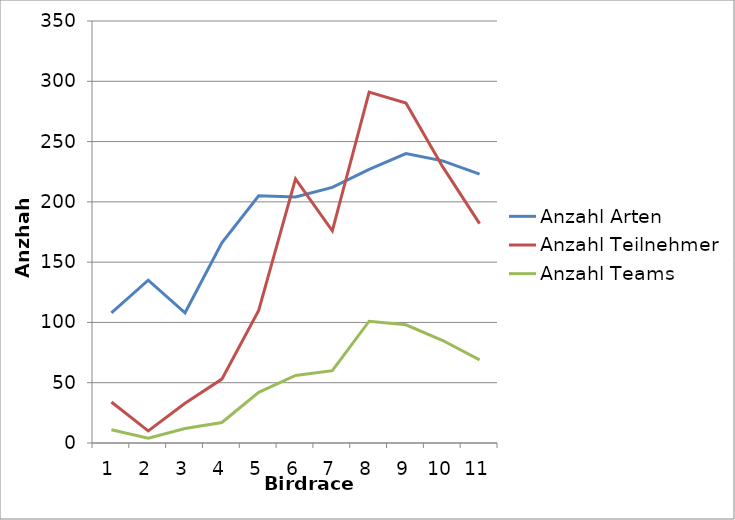
| Category | Anzahl Arten | Anzahl Teilnehmer | Anzahl Teams |
|---|---|---|---|
| 0 | 108 | 34 | 11 |
| 1 | 135 | 10 | 4 |
| 2 | 108 | 33 | 12 |
| 3 | 166 | 53 | 17 |
| 4 | 205 | 110 | 42 |
| 5 | 204 | 219 | 56 |
| 6 | 212 | 176 | 60 |
| 7 | 227 | 291 | 101 |
| 8 | 240 | 282 | 98 |
| 9 | 234 | 229 | 85 |
| 10 | 223 | 182 | 69 |